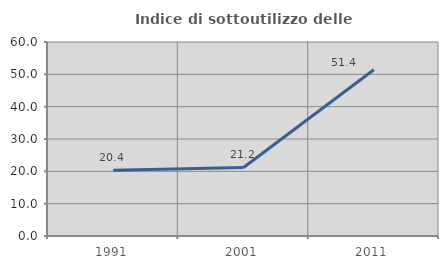
| Category | Indice di sottoutilizzo delle abitazioni  |
|---|---|
| 1991.0 | 20.37 |
| 2001.0 | 21.186 |
| 2011.0 | 51.402 |